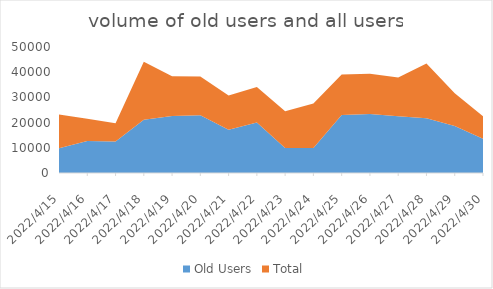
| Category | Old Users | Total |
|---|---|---|
| 44666.0 | 9852 | 13374 |
| 44667.0 | 12675 | 8856 |
| 44668.0 | 12496 | 7223 |
| 44669.0 | 21093 | 23023 |
| 44670.0 | 22667 | 15681 |
| 44671.0 | 22899 | 15438 |
| 44672.0 | 17185 | 13548 |
| 44673.0 | 20040 | 14038 |
| 44674.0 | 9917 | 14589 |
| 44675.0 | 9917 | 17639 |
| 44676.0 | 23008 | 16092 |
| 44677.0 | 23461 | 15888 |
| 44678.0 | 22510 | 15364 |
| 44679.0 | 21692 | 21747 |
| 44680.0 | 18699 | 12975 |
| 44681.0 | 13570 | 8903 |